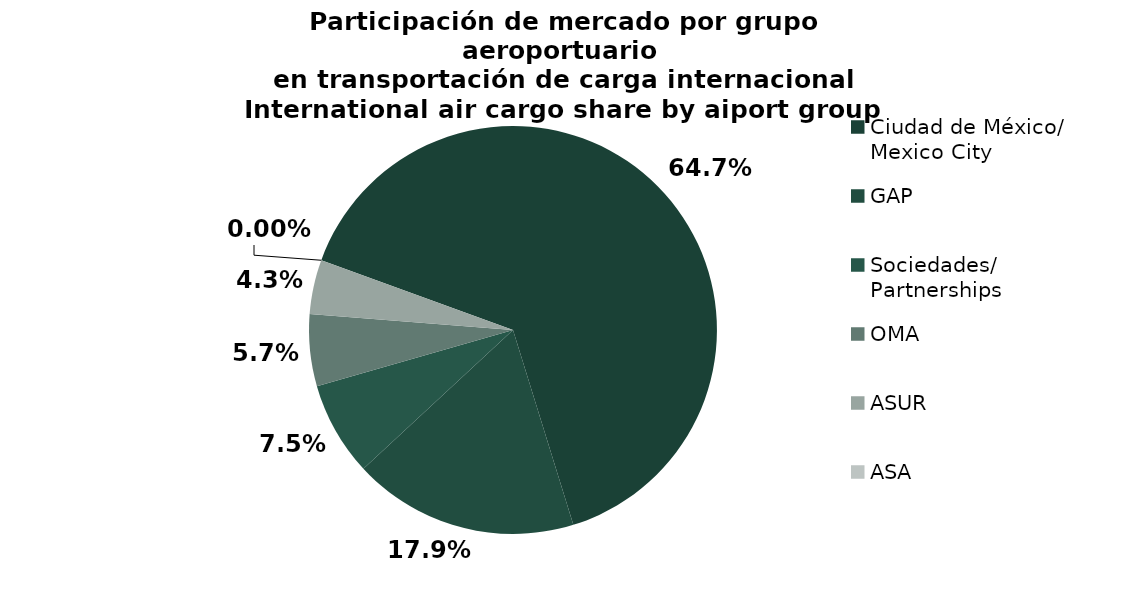
| Category | Series 0 |
|---|---|
| Ciudad de México/
Mexico City | 36429.03 |
| GAP | 10073.487 |
| Sociedades/
Partnerships | 4201.641 |
| OMA | 3203.183 |
| ASUR | 2424.624 |
| ASA | 3.4 |